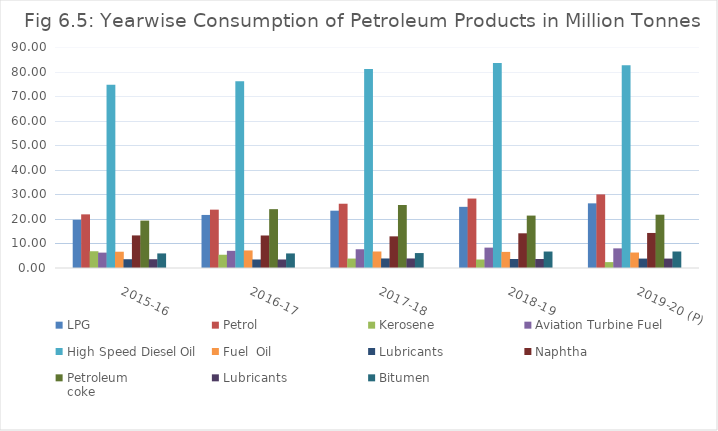
| Category | LPG | Petrol | Kerosene | Aviation Turbine Fuel | High Speed Diesel Oil | Fuel  Oil | Lubricants | Naphtha | Petroleum
coke | Bitumen |
|---|---|---|---|---|---|---|---|---|---|---|
| 2015-16 | 19.623 | 21.847 | 6.826 | 6.262 | 74.647 | 6.632 | 3.571 | 13.271 | 19.297 | 5.938 |
| 2016-17 | 21.608 | 23.765 | 5.397 | 6.998 | 76.027 | 7.15 | 3.47 | 13.241 | 23.964 | 5.936 |
| 2017-18 | 23.342 | 26.174 | 3.845 | 7.633 | 81.073 | 6.721 | 3.884 | 12.889 | 25.657 | 6.086 |
| 2018-19  | 24.907 | 28.284 | 3.459 | 8.3 | 83.528 | 6.564 | 3.668 | 14.131 | 21.346 | 6.708 |
| 2019-20 (P) | 26.33 | 29.975 | 2.397 | 7.999 | 82.602 | 6.302 | 3.833 | 14.268 | 21.708 | 6.72 |